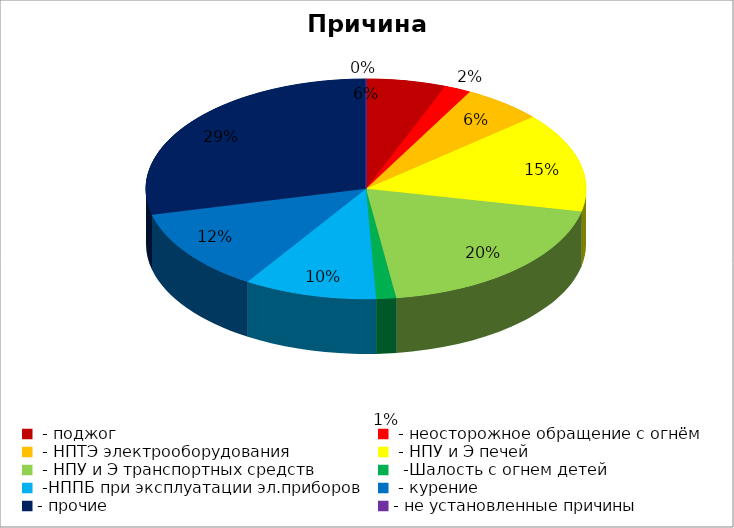
| Category | Причина пожара |
|---|---|
|  - поджог | 12 |
|  - неосторожное обращение с огнём | 4 |
|  - НПТЭ электрооборудования | 12 |
|  - НПУ и Э печей | 30 |
|  - НПУ и Э транспортных средств | 40 |
|   -Шалость с огнем детей | 3 |
|  -НППБ при эксплуатации эл.приборов | 20 |
|  - курение | 25 |
| - прочие | 59 |
| - не установленные причины | 0 |